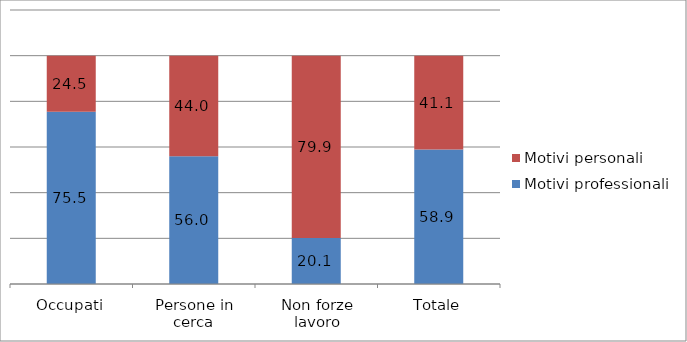
| Category | Motivi professionali | Motivi personali |
|---|---|---|
| Occupati | 75.484 | 24.502 |
| Persone in cerca | 55.951 | 44.049 |
| Non forze lavoro | 20.117 | 79.851 |
| Totale | 58.896 | 41.086 |